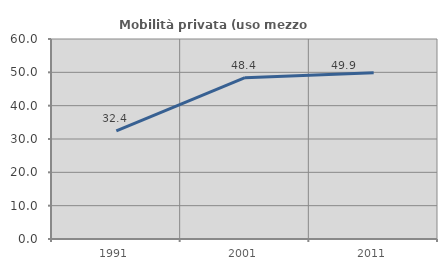
| Category | Mobilità privata (uso mezzo privato) |
|---|---|
| 1991.0 | 32.409 |
| 2001.0 | 48.38 |
| 2011.0 | 49.873 |